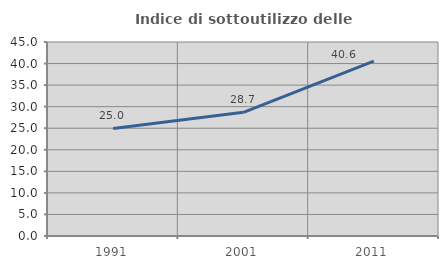
| Category | Indice di sottoutilizzo delle abitazioni  |
|---|---|
| 1991.0 | 24.955 |
| 2001.0 | 28.696 |
| 2011.0 | 40.587 |